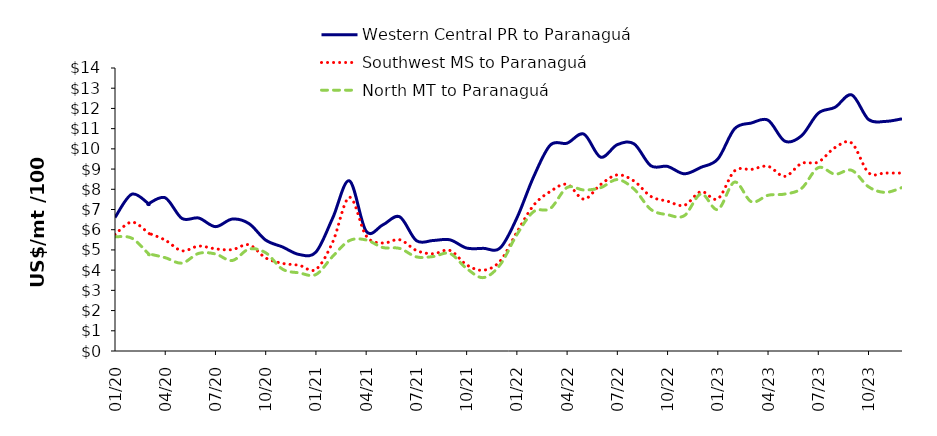
| Category | Western Central PR to Paranaguá | Southwest MS to Paranaguá | North MT to Paranaguá |
|---|---|---|---|
| 2020-01-01 | 6.604 | 5.76 | 5.65 |
| 2020-02-01 | 7.755 | 6.378 | 5.582 |
| 2020-03-01 | 7.288 | 5.833 | 4.809 |
| 2020-03-01 | 7.288 | 5.833 | 4.809 |
| 2020-04-01 | 7.579 | 5.485 | 4.615 |
| 2020-05-01 | 6.557 | 4.958 | 4.35 |
| 2020-06-01 | 6.578 | 5.189 | 4.829 |
| 2020-07-01 | 6.152 | 5.055 | 4.8 |
| 2020-08-01 | 6.527 | 5.014 | 4.475 |
| 2020-09-01 | 6.304 | 5.255 | 5.041 |
| 2020-10-01 | 5.485 | 4.604 | 4.859 |
| 2020-11-01 | 5.148 | 4.337 | 4.051 |
| 2020-12-01 | 4.773 | 4.238 | 3.864 |
| 2021-01-01 | 4.895 | 4.039 | 3.783 |
| 2021-02-01 | 6.576 | 5.385 | 4.679 |
| 2021-03-01 | 8.418 | 7.603 | 5.462 |
| 2021-04-01 | 5.925 | 5.696 | 5.494 |
| 2021-05-01 | 6.242 | 5.339 | 5.118 |
| 2021-06-01 | 6.639 | 5.506 | 5.075 |
| 2021-07-01 | 5.459 | 4.973 | 4.656 |
| 2021-08-01 | 5.467 | 4.811 | 4.673 |
| 2021-09-01 | 5.5 | 4.975 | 4.823 |
| 2021-10-01 | 5.092 | 4.262 | 4.082 |
| 2021-11-01 | 5.078 | 3.996 | 3.631 |
| 2021-12-01 | 5.096 | 4.447 | 4.265 |
| 2022-01-01 | 6.58 | 5.876 | 5.755 |
| 2022-02-01 | 8.617 | 7.207 | 6.894 |
| 2022-03-01 | 10.191 | 7.893 | 7.051 |
| 2022-04-01 | 10.282 | 8.244 | 8.087 |
| 2022-05-01 | 10.73 | 7.514 | 7.965 |
| 2022-06-01 | 9.589 | 8.235 | 8.077 |
| 2022-07-01 | 10.209 | 8.711 | 8.48 |
| 2022-08-01 | 10.246 | 8.405 | 8.008 |
| 2022-09-01 | 9.164 | 7.65 | 7.005 |
| 2022-10-01 | 9.132 | 7.408 | 6.741 |
| 2022-11-01 | 8.766 | 7.209 | 6.696 |
| 2022-12-01 | 9.088 | 7.884 | 7.771 |
| 2023-01-01 | 9.496 | 7.528 | 6.999 |
| 2023-02-01 | 10.993 | 8.91 | 8.357 |
| 2023-03-01 | 11.278 | 8.983 | 7.385 |
| 2023-04-01 | 11.418 | 9.136 | 7.703 |
| 2023-05-01 | 10.382 | 8.639 | 7.764 |
| 2023-06-01 | 10.648 | 9.278 | 8.043 |
| 2023-07-01 | 11.765 | 9.348 | 9.069 |
| 2023-08-01 | 12.056 | 10.064 | 8.747 |
| 2023-09-01 | 12.669 | 10.284 | 8.938 |
| 2023-10-01 | 11.455 | 8.821 | 8.124 |
| 2023-11-01 | 11.357 | 8.804 | 7.846 |
| 2023-12-01 | 11.485 | 8.803 | 8.084 |